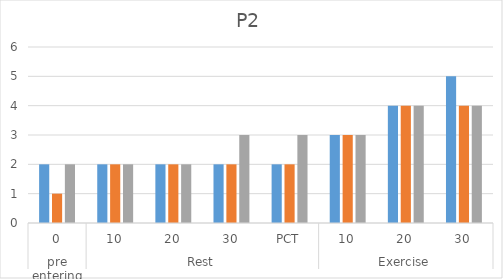
| Category | Water | Control | Menthol  |
|---|---|---|---|
| 0 | 2 | 1 | 2 |
| 1 | 2 | 2 | 2 |
| 2 | 2 | 2 | 2 |
| 3 | 2 | 2 | 3 |
| 4 | 2 | 2 | 3 |
| 5 | 3 | 3 | 3 |
| 6 | 4 | 4 | 4 |
| 7 | 5 | 4 | 4 |